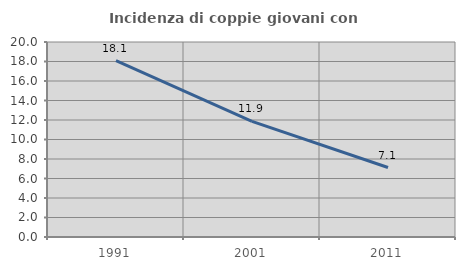
| Category | Incidenza di coppie giovani con figli |
|---|---|
| 1991.0 | 18.082 |
| 2001.0 | 11.855 |
| 2011.0 | 7.124 |